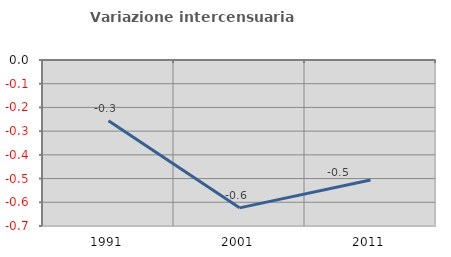
| Category | Variazione intercensuaria annua |
|---|---|
| 1991.0 | -0.256 |
| 2001.0 | -0.624 |
| 2011.0 | -0.506 |